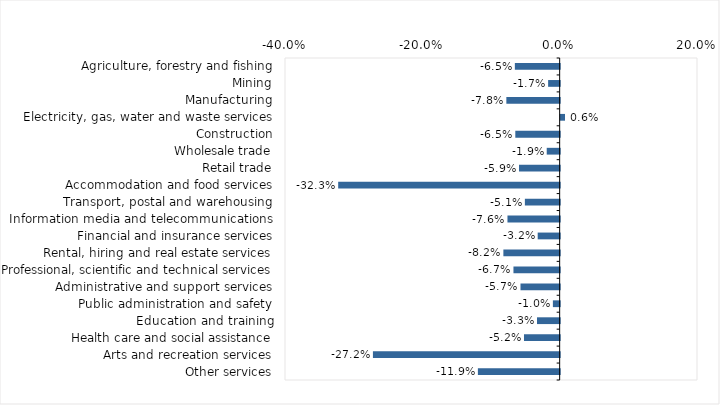
| Category | This week |
|---|---|
| Agriculture, forestry and fishing | -0.065 |
| Mining | -0.017 |
| Manufacturing | -0.078 |
| Electricity, gas, water and waste services | 0.006 |
| Construction | -0.065 |
| Wholesale trade | -0.019 |
| Retail trade | -0.059 |
| Accommodation and food services | -0.323 |
| Transport, postal and warehousing | -0.051 |
| Information media and telecommunications | -0.076 |
| Financial and insurance services | -0.032 |
| Rental, hiring and real estate services | -0.082 |
| Professional, scientific and technical services | -0.067 |
| Administrative and support services | -0.057 |
| Public administration and safety | -0.01 |
| Education and training | -0.033 |
| Health care and social assistance | -0.052 |
| Arts and recreation services | -0.272 |
| Other services | -0.119 |